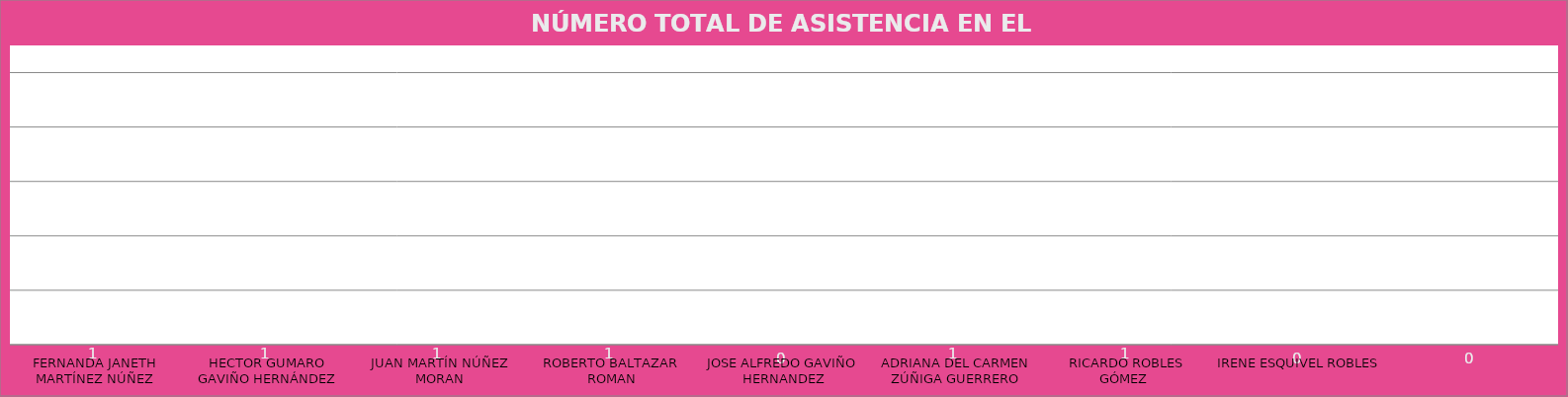
| Category | FERNANDA JANETH MARTÍNEZ NÚÑEZ |
|---|---|
| FERNANDA JANETH MARTÍNEZ NÚÑEZ | 1 |
| HECTOR GUMARO GAVIÑO HERNÁNDEZ | 1 |
| JUAN MARTÍN NÚÑEZ MORAN | 1 |
| ROBERTO BALTAZAR ROMAN | 1 |
| JOSE ALFREDO GAVIÑO HERNANDEZ | 0 |
| ADRIANA DEL CARMEN ZÚÑIGA GUERRERO | 1 |
| RICARDO ROBLES GÓMEZ   | 1 |
| IRENE ESQUIVEL ROBLES  | 0 |